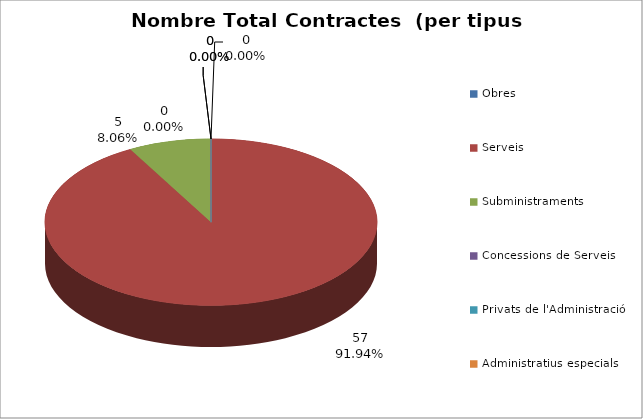
| Category | Nombre Total Contractes |
|---|---|
| Obres | 0 |
| Serveis | 57 |
| Subministraments | 5 |
| Concessions de Serveis | 0 |
| Privats de l'Administració | 0 |
| Administratius especials | 0 |